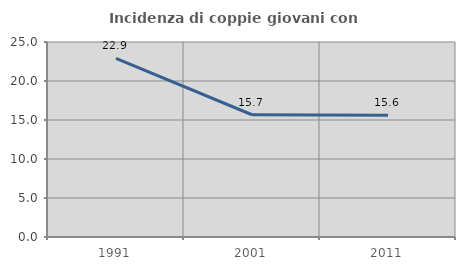
| Category | Incidenza di coppie giovani con figli |
|---|---|
| 1991.0 | 22.915 |
| 2001.0 | 15.672 |
| 2011.0 | 15.619 |